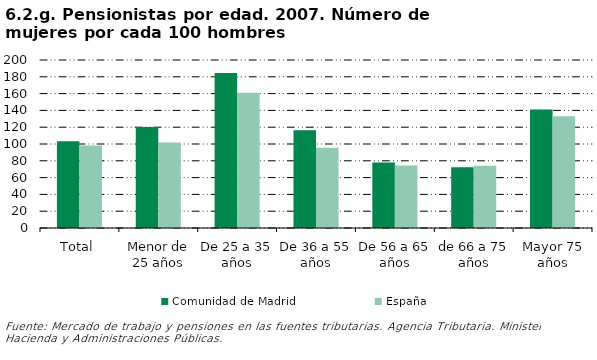
| Category | Comunidad de Madrid | España |
|---|---|---|
| Total | 103.367 | 98.253 |
| Menor de 25 años | 120.205 | 101.67 |
| De 25 a 35 años | 184.486 | 161.021 |
| De 36 a 55 años | 116.398 | 95.409 |
| De 56 a 65 años | 77.941 | 74.534 |
| de 66 a 75 años | 72.447 | 74.001 |
| Mayor 75 años | 140.984 | 133.01 |